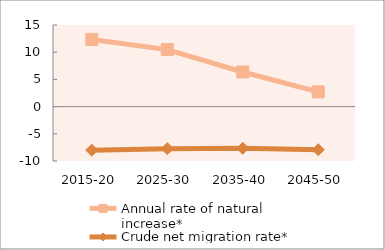
| Category | Annual rate of natural increase* | Crude net migration rate* |
|---|---|---|
| 2015-20 | 12.341 | -8.015 |
| 2025-30 | 10.478 | -7.727 |
| 2035-40 | 6.362 | -7.666 |
| 2045-50 | 2.714 | -7.925 |